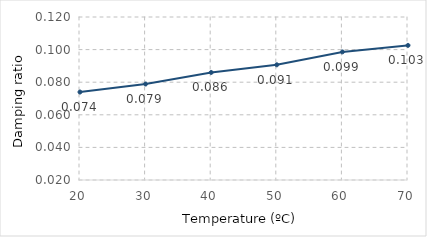
| Category | avg. |
|---|---|
| 20.0 | 0.074 |
| 30.0 | 0.079 |
| 40.0 | 0.086 |
| 50.0 | 0.091 |
| 60.0 | 0.099 |
| 70.0 | 0.103 |